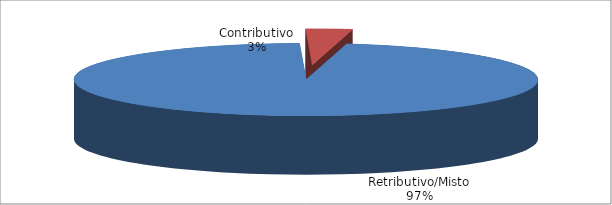
| Category | Series 1 |
|---|---|
| Retributivo/Misto | 14462 |
| Contributivo | 483 |